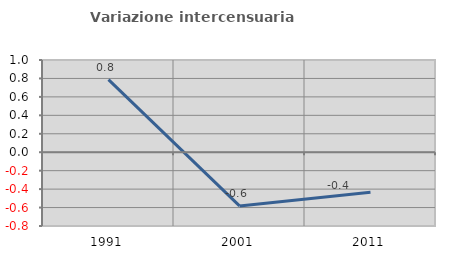
| Category | Variazione intercensuaria annua |
|---|---|
| 1991.0 | 0.787 |
| 2001.0 | -0.582 |
| 2011.0 | -0.435 |